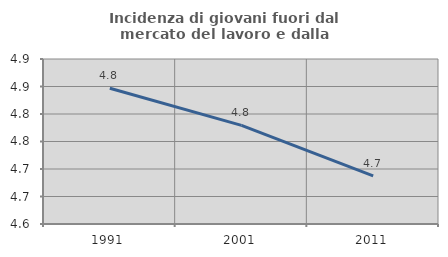
| Category | Incidenza di giovani fuori dal mercato del lavoro e dalla formazione  |
|---|---|
| 1991.0 | 4.847 |
| 2001.0 | 4.779 |
| 2011.0 | 4.688 |